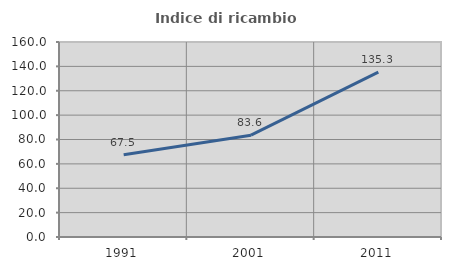
| Category | Indice di ricambio occupazionale  |
|---|---|
| 1991.0 | 67.456 |
| 2001.0 | 83.553 |
| 2011.0 | 135.294 |